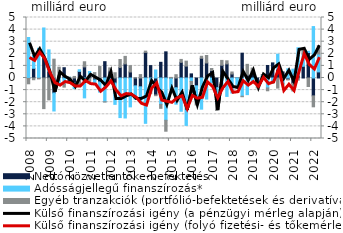
| Category | Nettó közvetlentőke-befektetés | Adósságjellegű finanszírozás* | Egyéb tranzakciók (portfólió-befektetések és derivatívák) |
|---|---|---|---|
| 2008.0 | -0.033 | 3.349 | -0.445 |
| 2008.0 | 0.803 | 1.088 | -0.143 |
| 2008.0 | -0.018 | 2.453 | -0.057 |
| 2008.0 | 1.693 | 2.442 | -2.531 |
| 2009.0 | 0.563 | 1.76 | -1.808 |
| 2009.0 | -1.245 | -1.481 | 1.555 |
| 2009.0 | 0.091 | -0.441 | 0.803 |
| 2009.0 | 0.849 | -0.524 | -0.23 |
| 2010.0 | -0.209 | 0.064 | 0.002 |
| 2010.0 | -0.422 | -0.45 | 0.129 |
| 2010.0 | 0.55 | 0.133 | -0.583 |
| 2010.0 | 0.916 | -1.641 | 0.426 |
| 2011.0 | 0.212 | 0.326 | -0.276 |
| 2011.0 | -0.157 | -0.266 | 0.447 |
| 2011.0 | -0.329 | -0.835 | 0.948 |
| 2011.0 | 1.349 | -1.961 | -0.027 |
| 2012.0 | 0.56 | -0.353 | 0.275 |
| 2012.0 | -0.417 | -1.763 | 0.435 |
| 2012.0 | 0.874 | -3.272 | 0.657 |
| 2012.0 | 1.166 | -3.304 | 0.621 |
| 2013.0 | 0.497 | -2.385 | 0.521 |
| 2013.0 | -0.651 | -1.108 | 0.016 |
| 2013.0 | -0.73 | -1.279 | 0.283 |
| 2013.0 | 2.115 | -3.746 | 0.106 |
| 2014.0 | 1.023 | -0.891 | -0.381 |
| 2014.0 | -1.403 | 0.662 | -0.06 |
| 2014.0 | 1.296 | -2.179 | -0.328 |
| 2014.0 | 2.162 | -3.495 | -0.903 |
| 2015.0 | -0.029 | -0.895 | 0.05 |
| 2015.0 | -0.806 | -1.363 | 0.273 |
| 2015.0 | 1.293 | -2.748 | 0.242 |
| 2015.0 | 0.981 | -3.918 | 0.413 |
| 2016.0 | 0.34 | -0.282 | -0.707 |
| 2016.0 | -0.651 | -1.305 | -0.283 |
| 2016.0 | 1.63 | -2.575 | 0.164 |
| 2016.0 | 1.244 | -1.739 | 0.616 |
| 2017.0 | 0.616 | -0.382 | 0.171 |
| 2017.0 | -0.797 | -1.326 | -0.56 |
| 2017.0 | 1.054 | -0.941 | 0.4 |
| 2017.0 | 1.164 | -1.523 | 0.258 |
| 2018.0 | 0.329 | -1.244 | 0.168 |
| 2018.0 | 0 | -0.633 | -0.193 |
| 2018.0 | 2.05 | -1.506 | -0.041 |
| 2018.0 | 0.233 | -1.376 | 0.896 |
| 2019.0 | 0.522 | -0.205 | 0.3 |
| 2019.0 | -0.551 | -0.023 | -0.247 |
| 2019.0 | 0.124 | 0.141 | 0.021 |
| 2019.0 | 1.034 | -0.821 | -0.234 |
| 2020.0 | 1.249 | -0.343 | -0.1 |
| 2020.0 | 0.723 | 1.241 | -0.836 |
| 2020.0 | 0.505 | -0.433 | -0.134 |
| 2020.0 | -0.117 | 0.762 | -0.046 |
| 2021.0 | -0.439 | 0.732 | -0.631 |
| 2021.0 | 0.196 | 2.305 | -0.172 |
| 2021.0 | 0.969 | 1.016 | 0.425 |
| 2021.0 | 2.107 | 0.102 | -0.703 |
| 2022.0 | -1.476 | 4.251 | -0.905 |
| 2022.0 | 0.503 | 1.483 | 0.676 |